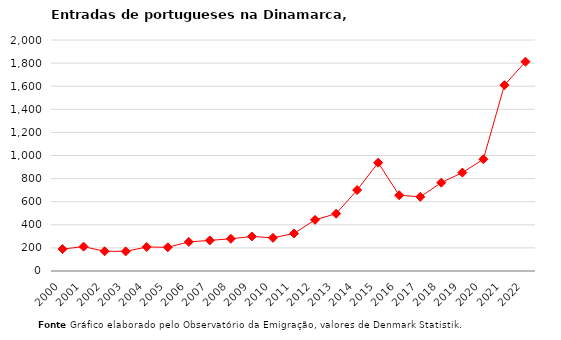
| Category | Entradas |
|---|---|
| 2000.0 | 190 |
| 2001.0 | 211 |
| 2002.0 | 171 |
| 2003.0 | 170 |
| 2004.0 | 208 |
| 2005.0 | 205 |
| 2006.0 | 252 |
| 2007.0 | 265 |
| 2008.0 | 279 |
| 2009.0 | 299 |
| 2010.0 | 287 |
| 2011.0 | 325 |
| 2012.0 | 443 |
| 2013.0 | 496 |
| 2014.0 | 701 |
| 2015.0 | 938 |
| 2016.0 | 656 |
| 2017.0 | 642 |
| 2018.0 | 765 |
| 2019.0 | 852 |
| 2020.0 | 968 |
| 2021.0 | 1609 |
| 2022.0 | 1812 |